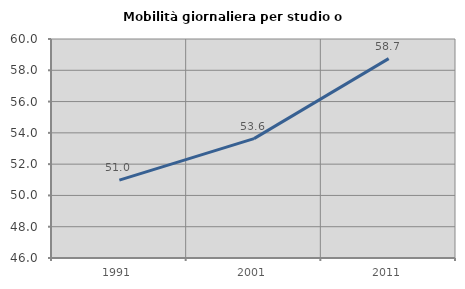
| Category | Mobilità giornaliera per studio o lavoro |
|---|---|
| 1991.0 | 50.976 |
| 2001.0 | 53.633 |
| 2011.0 | 58.746 |